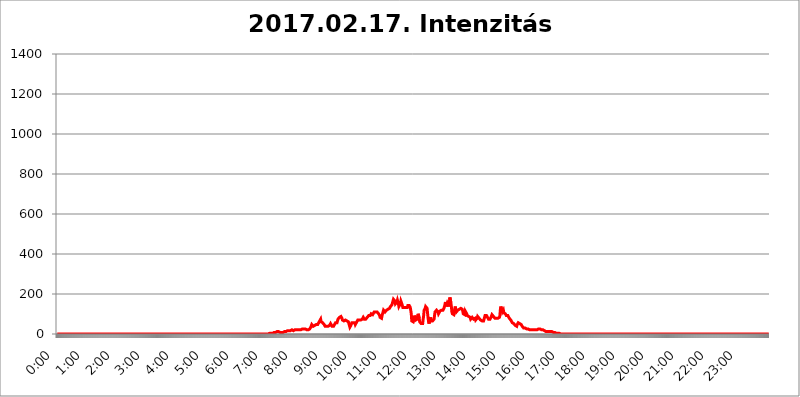
| Category | 2017.02.17. Intenzitás [W/m^2] |
|---|---|
| 0.0 | 0 |
| 0.0006944444444444445 | 0 |
| 0.001388888888888889 | 0 |
| 0.0020833333333333333 | 0 |
| 0.002777777777777778 | 0 |
| 0.003472222222222222 | 0 |
| 0.004166666666666667 | 0 |
| 0.004861111111111111 | 0 |
| 0.005555555555555556 | 0 |
| 0.0062499999999999995 | 0 |
| 0.006944444444444444 | 0 |
| 0.007638888888888889 | 0 |
| 0.008333333333333333 | 0 |
| 0.009027777777777779 | 0 |
| 0.009722222222222222 | 0 |
| 0.010416666666666666 | 0 |
| 0.011111111111111112 | 0 |
| 0.011805555555555555 | 0 |
| 0.012499999999999999 | 0 |
| 0.013194444444444444 | 0 |
| 0.013888888888888888 | 0 |
| 0.014583333333333332 | 0 |
| 0.015277777777777777 | 0 |
| 0.015972222222222224 | 0 |
| 0.016666666666666666 | 0 |
| 0.017361111111111112 | 0 |
| 0.018055555555555557 | 0 |
| 0.01875 | 0 |
| 0.019444444444444445 | 0 |
| 0.02013888888888889 | 0 |
| 0.020833333333333332 | 0 |
| 0.02152777777777778 | 0 |
| 0.022222222222222223 | 0 |
| 0.02291666666666667 | 0 |
| 0.02361111111111111 | 0 |
| 0.024305555555555556 | 0 |
| 0.024999999999999998 | 0 |
| 0.025694444444444447 | 0 |
| 0.02638888888888889 | 0 |
| 0.027083333333333334 | 0 |
| 0.027777777777777776 | 0 |
| 0.02847222222222222 | 0 |
| 0.029166666666666664 | 0 |
| 0.029861111111111113 | 0 |
| 0.030555555555555555 | 0 |
| 0.03125 | 0 |
| 0.03194444444444445 | 0 |
| 0.03263888888888889 | 0 |
| 0.03333333333333333 | 0 |
| 0.034027777777777775 | 0 |
| 0.034722222222222224 | 0 |
| 0.035416666666666666 | 0 |
| 0.036111111111111115 | 0 |
| 0.03680555555555556 | 0 |
| 0.0375 | 0 |
| 0.03819444444444444 | 0 |
| 0.03888888888888889 | 0 |
| 0.03958333333333333 | 0 |
| 0.04027777777777778 | 0 |
| 0.04097222222222222 | 0 |
| 0.041666666666666664 | 0 |
| 0.042361111111111106 | 0 |
| 0.04305555555555556 | 0 |
| 0.043750000000000004 | 0 |
| 0.044444444444444446 | 0 |
| 0.04513888888888889 | 0 |
| 0.04583333333333334 | 0 |
| 0.04652777777777778 | 0 |
| 0.04722222222222222 | 0 |
| 0.04791666666666666 | 0 |
| 0.04861111111111111 | 0 |
| 0.049305555555555554 | 0 |
| 0.049999999999999996 | 0 |
| 0.05069444444444445 | 0 |
| 0.051388888888888894 | 0 |
| 0.052083333333333336 | 0 |
| 0.05277777777777778 | 0 |
| 0.05347222222222222 | 0 |
| 0.05416666666666667 | 0 |
| 0.05486111111111111 | 0 |
| 0.05555555555555555 | 0 |
| 0.05625 | 0 |
| 0.05694444444444444 | 0 |
| 0.057638888888888885 | 0 |
| 0.05833333333333333 | 0 |
| 0.05902777777777778 | 0 |
| 0.059722222222222225 | 0 |
| 0.06041666666666667 | 0 |
| 0.061111111111111116 | 0 |
| 0.06180555555555556 | 0 |
| 0.0625 | 0 |
| 0.06319444444444444 | 0 |
| 0.06388888888888888 | 0 |
| 0.06458333333333334 | 0 |
| 0.06527777777777778 | 0 |
| 0.06597222222222222 | 0 |
| 0.06666666666666667 | 0 |
| 0.06736111111111111 | 0 |
| 0.06805555555555555 | 0 |
| 0.06874999999999999 | 0 |
| 0.06944444444444443 | 0 |
| 0.07013888888888889 | 0 |
| 0.07083333333333333 | 0 |
| 0.07152777777777779 | 0 |
| 0.07222222222222223 | 0 |
| 0.07291666666666667 | 0 |
| 0.07361111111111111 | 0 |
| 0.07430555555555556 | 0 |
| 0.075 | 0 |
| 0.07569444444444444 | 0 |
| 0.0763888888888889 | 0 |
| 0.07708333333333334 | 0 |
| 0.07777777777777778 | 0 |
| 0.07847222222222222 | 0 |
| 0.07916666666666666 | 0 |
| 0.0798611111111111 | 0 |
| 0.08055555555555556 | 0 |
| 0.08125 | 0 |
| 0.08194444444444444 | 0 |
| 0.08263888888888889 | 0 |
| 0.08333333333333333 | 0 |
| 0.08402777777777777 | 0 |
| 0.08472222222222221 | 0 |
| 0.08541666666666665 | 0 |
| 0.08611111111111112 | 0 |
| 0.08680555555555557 | 0 |
| 0.08750000000000001 | 0 |
| 0.08819444444444445 | 0 |
| 0.08888888888888889 | 0 |
| 0.08958333333333333 | 0 |
| 0.09027777777777778 | 0 |
| 0.09097222222222222 | 0 |
| 0.09166666666666667 | 0 |
| 0.09236111111111112 | 0 |
| 0.09305555555555556 | 0 |
| 0.09375 | 0 |
| 0.09444444444444444 | 0 |
| 0.09513888888888888 | 0 |
| 0.09583333333333333 | 0 |
| 0.09652777777777777 | 0 |
| 0.09722222222222222 | 0 |
| 0.09791666666666667 | 0 |
| 0.09861111111111111 | 0 |
| 0.09930555555555555 | 0 |
| 0.09999999999999999 | 0 |
| 0.10069444444444443 | 0 |
| 0.1013888888888889 | 0 |
| 0.10208333333333335 | 0 |
| 0.10277777777777779 | 0 |
| 0.10347222222222223 | 0 |
| 0.10416666666666667 | 0 |
| 0.10486111111111111 | 0 |
| 0.10555555555555556 | 0 |
| 0.10625 | 0 |
| 0.10694444444444444 | 0 |
| 0.1076388888888889 | 0 |
| 0.10833333333333334 | 0 |
| 0.10902777777777778 | 0 |
| 0.10972222222222222 | 0 |
| 0.1111111111111111 | 0 |
| 0.11180555555555556 | 0 |
| 0.11180555555555556 | 0 |
| 0.1125 | 0 |
| 0.11319444444444444 | 0 |
| 0.11388888888888889 | 0 |
| 0.11458333333333333 | 0 |
| 0.11527777777777777 | 0 |
| 0.11597222222222221 | 0 |
| 0.11666666666666665 | 0 |
| 0.1173611111111111 | 0 |
| 0.11805555555555557 | 0 |
| 0.11944444444444445 | 0 |
| 0.12013888888888889 | 0 |
| 0.12083333333333333 | 0 |
| 0.12152777777777778 | 0 |
| 0.12222222222222223 | 0 |
| 0.12291666666666667 | 0 |
| 0.12291666666666667 | 0 |
| 0.12361111111111112 | 0 |
| 0.12430555555555556 | 0 |
| 0.125 | 0 |
| 0.12569444444444444 | 0 |
| 0.12638888888888888 | 0 |
| 0.12708333333333333 | 0 |
| 0.16875 | 0 |
| 0.12847222222222224 | 0 |
| 0.12916666666666668 | 0 |
| 0.12986111111111112 | 0 |
| 0.13055555555555556 | 0 |
| 0.13125 | 0 |
| 0.13194444444444445 | 0 |
| 0.1326388888888889 | 0 |
| 0.13333333333333333 | 0 |
| 0.13402777777777777 | 0 |
| 0.13402777777777777 | 0 |
| 0.13472222222222222 | 0 |
| 0.13541666666666666 | 0 |
| 0.1361111111111111 | 0 |
| 0.13749999999999998 | 0 |
| 0.13819444444444443 | 0 |
| 0.1388888888888889 | 0 |
| 0.13958333333333334 | 0 |
| 0.14027777777777778 | 0 |
| 0.14097222222222222 | 0 |
| 0.14166666666666666 | 0 |
| 0.1423611111111111 | 0 |
| 0.14305555555555557 | 0 |
| 0.14375000000000002 | 0 |
| 0.14444444444444446 | 0 |
| 0.1451388888888889 | 0 |
| 0.1451388888888889 | 0 |
| 0.14652777777777778 | 0 |
| 0.14722222222222223 | 0 |
| 0.14791666666666667 | 0 |
| 0.1486111111111111 | 0 |
| 0.14930555555555555 | 0 |
| 0.15 | 0 |
| 0.15069444444444444 | 0 |
| 0.15138888888888888 | 0 |
| 0.15208333333333332 | 0 |
| 0.15277777777777776 | 0 |
| 0.15347222222222223 | 0 |
| 0.15416666666666667 | 0 |
| 0.15486111111111112 | 0 |
| 0.15555555555555556 | 0 |
| 0.15625 | 0 |
| 0.15694444444444444 | 0 |
| 0.15763888888888888 | 0 |
| 0.15833333333333333 | 0 |
| 0.15902777777777777 | 0 |
| 0.15972222222222224 | 0 |
| 0.16041666666666668 | 0 |
| 0.16111111111111112 | 0 |
| 0.16180555555555556 | 0 |
| 0.1625 | 0 |
| 0.16319444444444445 | 0 |
| 0.1638888888888889 | 0 |
| 0.16458333333333333 | 0 |
| 0.16527777777777777 | 0 |
| 0.16597222222222222 | 0 |
| 0.16666666666666666 | 0 |
| 0.1673611111111111 | 0 |
| 0.16805555555555554 | 0 |
| 0.16874999999999998 | 0 |
| 0.16944444444444443 | 0 |
| 0.17013888888888887 | 0 |
| 0.1708333333333333 | 0 |
| 0.17152777777777775 | 0 |
| 0.17222222222222225 | 0 |
| 0.1729166666666667 | 0 |
| 0.17361111111111113 | 0 |
| 0.17430555555555557 | 0 |
| 0.17500000000000002 | 0 |
| 0.17569444444444446 | 0 |
| 0.1763888888888889 | 0 |
| 0.17708333333333334 | 0 |
| 0.17777777777777778 | 0 |
| 0.17847222222222223 | 0 |
| 0.17916666666666667 | 0 |
| 0.1798611111111111 | 0 |
| 0.18055555555555555 | 0 |
| 0.18125 | 0 |
| 0.18194444444444444 | 0 |
| 0.1826388888888889 | 0 |
| 0.18333333333333335 | 0 |
| 0.1840277777777778 | 0 |
| 0.18472222222222223 | 0 |
| 0.18541666666666667 | 0 |
| 0.18611111111111112 | 0 |
| 0.18680555555555556 | 0 |
| 0.1875 | 0 |
| 0.18819444444444444 | 0 |
| 0.18888888888888888 | 0 |
| 0.18958333333333333 | 0 |
| 0.19027777777777777 | 0 |
| 0.1909722222222222 | 0 |
| 0.19166666666666665 | 0 |
| 0.19236111111111112 | 0 |
| 0.19305555555555554 | 0 |
| 0.19375 | 0 |
| 0.19444444444444445 | 0 |
| 0.1951388888888889 | 0 |
| 0.19583333333333333 | 0 |
| 0.19652777777777777 | 0 |
| 0.19722222222222222 | 0 |
| 0.19791666666666666 | 0 |
| 0.1986111111111111 | 0 |
| 0.19930555555555554 | 0 |
| 0.19999999999999998 | 0 |
| 0.20069444444444443 | 0 |
| 0.20138888888888887 | 0 |
| 0.2020833333333333 | 0 |
| 0.2027777777777778 | 0 |
| 0.2034722222222222 | 0 |
| 0.2041666666666667 | 0 |
| 0.20486111111111113 | 0 |
| 0.20555555555555557 | 0 |
| 0.20625000000000002 | 0 |
| 0.20694444444444446 | 0 |
| 0.2076388888888889 | 0 |
| 0.20833333333333334 | 0 |
| 0.20902777777777778 | 0 |
| 0.20972222222222223 | 0 |
| 0.21041666666666667 | 0 |
| 0.2111111111111111 | 0 |
| 0.21180555555555555 | 0 |
| 0.2125 | 0 |
| 0.21319444444444444 | 0 |
| 0.2138888888888889 | 0 |
| 0.21458333333333335 | 0 |
| 0.2152777777777778 | 0 |
| 0.21597222222222223 | 0 |
| 0.21666666666666667 | 0 |
| 0.21736111111111112 | 0 |
| 0.21805555555555556 | 0 |
| 0.21875 | 0 |
| 0.21944444444444444 | 0 |
| 0.22013888888888888 | 0 |
| 0.22083333333333333 | 0 |
| 0.22152777777777777 | 0 |
| 0.2222222222222222 | 0 |
| 0.22291666666666665 | 0 |
| 0.2236111111111111 | 0 |
| 0.22430555555555556 | 0 |
| 0.225 | 0 |
| 0.22569444444444445 | 0 |
| 0.2263888888888889 | 0 |
| 0.22708333333333333 | 0 |
| 0.22777777777777777 | 0 |
| 0.22847222222222222 | 0 |
| 0.22916666666666666 | 0 |
| 0.2298611111111111 | 0 |
| 0.23055555555555554 | 0 |
| 0.23124999999999998 | 0 |
| 0.23194444444444443 | 0 |
| 0.23263888888888887 | 0 |
| 0.2333333333333333 | 0 |
| 0.2340277777777778 | 0 |
| 0.2347222222222222 | 0 |
| 0.2354166666666667 | 0 |
| 0.23611111111111113 | 0 |
| 0.23680555555555557 | 0 |
| 0.23750000000000002 | 0 |
| 0.23819444444444446 | 0 |
| 0.2388888888888889 | 0 |
| 0.23958333333333334 | 0 |
| 0.24027777777777778 | 0 |
| 0.24097222222222223 | 0 |
| 0.24166666666666667 | 0 |
| 0.2423611111111111 | 0 |
| 0.24305555555555555 | 0 |
| 0.24375 | 0 |
| 0.24444444444444446 | 0 |
| 0.24513888888888888 | 0 |
| 0.24583333333333335 | 0 |
| 0.2465277777777778 | 0 |
| 0.24722222222222223 | 0 |
| 0.24791666666666667 | 0 |
| 0.24861111111111112 | 0 |
| 0.24930555555555556 | 0 |
| 0.25 | 0 |
| 0.25069444444444444 | 0 |
| 0.2513888888888889 | 0 |
| 0.2520833333333333 | 0 |
| 0.25277777777777777 | 0 |
| 0.2534722222222222 | 0 |
| 0.25416666666666665 | 0 |
| 0.2548611111111111 | 0 |
| 0.2555555555555556 | 0 |
| 0.25625000000000003 | 0 |
| 0.2569444444444445 | 0 |
| 0.2576388888888889 | 0 |
| 0.25833333333333336 | 0 |
| 0.2590277777777778 | 0 |
| 0.25972222222222224 | 0 |
| 0.2604166666666667 | 0 |
| 0.2611111111111111 | 0 |
| 0.26180555555555557 | 0 |
| 0.2625 | 0 |
| 0.26319444444444445 | 0 |
| 0.2638888888888889 | 0 |
| 0.26458333333333334 | 0 |
| 0.2652777777777778 | 0 |
| 0.2659722222222222 | 0 |
| 0.26666666666666666 | 0 |
| 0.2673611111111111 | 0 |
| 0.26805555555555555 | 0 |
| 0.26875 | 0 |
| 0.26944444444444443 | 0 |
| 0.2701388888888889 | 0 |
| 0.2708333333333333 | 0 |
| 0.27152777777777776 | 0 |
| 0.2722222222222222 | 0 |
| 0.27291666666666664 | 0 |
| 0.2736111111111111 | 0 |
| 0.2743055555555555 | 0 |
| 0.27499999999999997 | 0 |
| 0.27569444444444446 | 0 |
| 0.27638888888888885 | 0 |
| 0.27708333333333335 | 0 |
| 0.2777777777777778 | 0 |
| 0.27847222222222223 | 0 |
| 0.2791666666666667 | 0 |
| 0.2798611111111111 | 0 |
| 0.28055555555555556 | 0 |
| 0.28125 | 0 |
| 0.28194444444444444 | 0 |
| 0.2826388888888889 | 0 |
| 0.2833333333333333 | 0 |
| 0.28402777777777777 | 0 |
| 0.2847222222222222 | 0 |
| 0.28541666666666665 | 0 |
| 0.28611111111111115 | 0 |
| 0.28680555555555554 | 0 |
| 0.28750000000000003 | 0 |
| 0.2881944444444445 | 0 |
| 0.2888888888888889 | 0 |
| 0.28958333333333336 | 0 |
| 0.2902777777777778 | 0 |
| 0.29097222222222224 | 0 |
| 0.2916666666666667 | 0 |
| 0.2923611111111111 | 0 |
| 0.29305555555555557 | 0 |
| 0.29375 | 0 |
| 0.29444444444444445 | 0 |
| 0.2951388888888889 | 0 |
| 0.29583333333333334 | 0 |
| 0.2965277777777778 | 3.525 |
| 0.2972222222222222 | 3.525 |
| 0.29791666666666666 | 3.525 |
| 0.2986111111111111 | 3.525 |
| 0.29930555555555555 | 3.525 |
| 0.3 | 3.525 |
| 0.30069444444444443 | 3.525 |
| 0.3013888888888889 | 3.525 |
| 0.3020833333333333 | 3.525 |
| 0.30277777777777776 | 3.525 |
| 0.3034722222222222 | 7.887 |
| 0.30416666666666664 | 7.887 |
| 0.3048611111111111 | 7.887 |
| 0.3055555555555555 | 7.887 |
| 0.30624999999999997 | 7.887 |
| 0.3069444444444444 | 7.887 |
| 0.3076388888888889 | 7.887 |
| 0.30833333333333335 | 12.257 |
| 0.3090277777777778 | 12.257 |
| 0.30972222222222223 | 12.257 |
| 0.3104166666666667 | 12.257 |
| 0.3111111111111111 | 7.887 |
| 0.31180555555555556 | 7.887 |
| 0.3125 | 7.887 |
| 0.31319444444444444 | 7.887 |
| 0.3138888888888889 | 7.887 |
| 0.3145833333333333 | 7.887 |
| 0.31527777777777777 | 7.887 |
| 0.3159722222222222 | 7.887 |
| 0.31666666666666665 | 7.887 |
| 0.31736111111111115 | 7.887 |
| 0.31805555555555554 | 7.887 |
| 0.31875000000000003 | 12.257 |
| 0.3194444444444445 | 12.257 |
| 0.3201388888888889 | 12.257 |
| 0.32083333333333336 | 12.257 |
| 0.3215277777777778 | 12.257 |
| 0.32222222222222224 | 12.257 |
| 0.3229166666666667 | 16.636 |
| 0.3236111111111111 | 16.636 |
| 0.32430555555555557 | 16.636 |
| 0.325 | 16.636 |
| 0.32569444444444445 | 16.636 |
| 0.3263888888888889 | 16.636 |
| 0.32708333333333334 | 16.636 |
| 0.3277777777777778 | 21.024 |
| 0.3284722222222222 | 21.024 |
| 0.32916666666666666 | 21.024 |
| 0.3298611111111111 | 21.024 |
| 0.33055555555555555 | 21.024 |
| 0.33125 | 16.636 |
| 0.33194444444444443 | 21.024 |
| 0.3326388888888889 | 21.024 |
| 0.3333333333333333 | 21.024 |
| 0.3340277777777778 | 21.024 |
| 0.3347222222222222 | 21.024 |
| 0.3354166666666667 | 21.024 |
| 0.3361111111111111 | 21.024 |
| 0.3368055555555556 | 21.024 |
| 0.33749999999999997 | 21.024 |
| 0.33819444444444446 | 21.024 |
| 0.33888888888888885 | 21.024 |
| 0.33958333333333335 | 21.024 |
| 0.34027777777777773 | 21.024 |
| 0.34097222222222223 | 21.024 |
| 0.3416666666666666 | 21.024 |
| 0.3423611111111111 | 21.024 |
| 0.3430555555555555 | 21.024 |
| 0.34375 | 25.419 |
| 0.3444444444444445 | 25.419 |
| 0.3451388888888889 | 25.419 |
| 0.3458333333333334 | 25.419 |
| 0.34652777777777777 | 25.419 |
| 0.34722222222222227 | 25.419 |
| 0.34791666666666665 | 25.419 |
| 0.34861111111111115 | 25.419 |
| 0.34930555555555554 | 25.419 |
| 0.35000000000000003 | 21.024 |
| 0.3506944444444444 | 25.419 |
| 0.3513888888888889 | 21.024 |
| 0.3520833333333333 | 21.024 |
| 0.3527777777777778 | 21.024 |
| 0.3534722222222222 | 25.419 |
| 0.3541666666666667 | 25.419 |
| 0.3548611111111111 | 29.823 |
| 0.35555555555555557 | 34.234 |
| 0.35625 | 38.653 |
| 0.35694444444444445 | 47.511 |
| 0.3576388888888889 | 43.079 |
| 0.35833333333333334 | 43.079 |
| 0.3590277777777778 | 38.653 |
| 0.3597222222222222 | 38.653 |
| 0.36041666666666666 | 38.653 |
| 0.3611111111111111 | 43.079 |
| 0.36180555555555555 | 43.079 |
| 0.3625 | 47.511 |
| 0.36319444444444443 | 47.511 |
| 0.3638888888888889 | 47.511 |
| 0.3645833333333333 | 47.511 |
| 0.3652777777777778 | 47.511 |
| 0.3659722222222222 | 47.511 |
| 0.3666666666666667 | 51.951 |
| 0.3673611111111111 | 60.85 |
| 0.3680555555555556 | 56.398 |
| 0.36874999999999997 | 65.31 |
| 0.36944444444444446 | 74.246 |
| 0.37013888888888885 | 60.85 |
| 0.37083333333333335 | 60.85 |
| 0.37152777777777773 | 56.398 |
| 0.37222222222222223 | 56.398 |
| 0.3729166666666666 | 56.398 |
| 0.3736111111111111 | 51.951 |
| 0.3743055555555555 | 47.511 |
| 0.375 | 43.079 |
| 0.3756944444444445 | 38.653 |
| 0.3763888888888889 | 38.653 |
| 0.3770833333333334 | 38.653 |
| 0.37777777777777777 | 38.653 |
| 0.37847222222222227 | 38.653 |
| 0.37916666666666665 | 38.653 |
| 0.37986111111111115 | 38.653 |
| 0.38055555555555554 | 43.079 |
| 0.38125000000000003 | 38.653 |
| 0.3819444444444444 | 43.079 |
| 0.3826388888888889 | 47.511 |
| 0.3833333333333333 | 51.951 |
| 0.3840277777777778 | 51.951 |
| 0.3847222222222222 | 47.511 |
| 0.3854166666666667 | 38.653 |
| 0.3861111111111111 | 38.653 |
| 0.38680555555555557 | 38.653 |
| 0.3875 | 38.653 |
| 0.38819444444444445 | 43.079 |
| 0.3888888888888889 | 47.511 |
| 0.38958333333333334 | 51.951 |
| 0.3902777777777778 | 56.398 |
| 0.3909722222222222 | 51.951 |
| 0.39166666666666666 | 51.951 |
| 0.3923611111111111 | 56.398 |
| 0.39305555555555555 | 60.85 |
| 0.39375 | 74.246 |
| 0.39444444444444443 | 74.246 |
| 0.3951388888888889 | 78.722 |
| 0.3958333333333333 | 83.205 |
| 0.3965277777777778 | 83.205 |
| 0.3972222222222222 | 87.692 |
| 0.3979166666666667 | 87.692 |
| 0.3986111111111111 | 83.205 |
| 0.3993055555555556 | 78.722 |
| 0.39999999999999997 | 69.775 |
| 0.40069444444444446 | 69.775 |
| 0.40138888888888885 | 65.31 |
| 0.40208333333333335 | 65.31 |
| 0.40277777777777773 | 65.31 |
| 0.40347222222222223 | 69.775 |
| 0.4041666666666666 | 69.775 |
| 0.4048611111111111 | 65.31 |
| 0.4055555555555555 | 65.31 |
| 0.40625 | 65.31 |
| 0.4069444444444445 | 60.85 |
| 0.4076388888888889 | 65.31 |
| 0.4083333333333334 | 60.85 |
| 0.40902777777777777 | 51.951 |
| 0.40972222222222227 | 43.079 |
| 0.41041666666666665 | 34.234 |
| 0.41111111111111115 | 38.653 |
| 0.41180555555555554 | 43.079 |
| 0.41250000000000003 | 47.511 |
| 0.4131944444444444 | 56.398 |
| 0.4138888888888889 | 56.398 |
| 0.4145833333333333 | 51.951 |
| 0.4152777777777778 | 56.398 |
| 0.4159722222222222 | 56.398 |
| 0.4166666666666667 | 56.398 |
| 0.4173611111111111 | 56.398 |
| 0.41805555555555557 | 47.511 |
| 0.41875 | 47.511 |
| 0.41944444444444445 | 47.511 |
| 0.4201388888888889 | 60.85 |
| 0.42083333333333334 | 65.31 |
| 0.4215277777777778 | 69.775 |
| 0.4222222222222222 | 69.775 |
| 0.42291666666666666 | 69.775 |
| 0.4236111111111111 | 69.775 |
| 0.42430555555555555 | 69.775 |
| 0.425 | 69.775 |
| 0.42569444444444443 | 69.775 |
| 0.4263888888888889 | 74.246 |
| 0.4270833333333333 | 74.246 |
| 0.4277777777777778 | 74.246 |
| 0.4284722222222222 | 78.722 |
| 0.4291666666666667 | 83.205 |
| 0.4298611111111111 | 78.722 |
| 0.4305555555555556 | 74.246 |
| 0.43124999999999997 | 74.246 |
| 0.43194444444444446 | 74.246 |
| 0.43263888888888885 | 74.246 |
| 0.43333333333333335 | 74.246 |
| 0.43402777777777773 | 78.722 |
| 0.43472222222222223 | 83.205 |
| 0.4354166666666666 | 83.205 |
| 0.4361111111111111 | 87.692 |
| 0.4368055555555555 | 92.184 |
| 0.4375 | 87.692 |
| 0.4381944444444445 | 92.184 |
| 0.4388888888888889 | 92.184 |
| 0.4395833333333334 | 96.682 |
| 0.44027777777777777 | 101.184 |
| 0.44097222222222227 | 101.184 |
| 0.44166666666666665 | 101.184 |
| 0.44236111111111115 | 96.682 |
| 0.44305555555555554 | 96.682 |
| 0.44375000000000003 | 96.682 |
| 0.4444444444444444 | 110.201 |
| 0.4451388888888889 | 114.716 |
| 0.4458333333333333 | 114.716 |
| 0.4465277777777778 | 110.201 |
| 0.4472222222222222 | 105.69 |
| 0.4479166666666667 | 105.69 |
| 0.4486111111111111 | 110.201 |
| 0.44930555555555557 | 105.69 |
| 0.45 | 105.69 |
| 0.45069444444444445 | 101.184 |
| 0.4513888888888889 | 96.682 |
| 0.45208333333333334 | 92.184 |
| 0.4527777777777778 | 83.205 |
| 0.4534722222222222 | 83.205 |
| 0.45416666666666666 | 78.722 |
| 0.4548611111111111 | 78.722 |
| 0.45555555555555555 | 92.184 |
| 0.45625 | 96.682 |
| 0.45694444444444443 | 110.201 |
| 0.4576388888888889 | 119.235 |
| 0.4583333333333333 | 119.235 |
| 0.4590277777777778 | 114.716 |
| 0.4597222222222222 | 110.201 |
| 0.4604166666666667 | 105.69 |
| 0.4611111111111111 | 110.201 |
| 0.4618055555555556 | 119.235 |
| 0.46249999999999997 | 123.758 |
| 0.46319444444444446 | 123.758 |
| 0.46388888888888885 | 123.758 |
| 0.46458333333333335 | 123.758 |
| 0.46527777777777773 | 123.758 |
| 0.46597222222222223 | 128.284 |
| 0.4666666666666666 | 132.814 |
| 0.4673611111111111 | 137.347 |
| 0.4680555555555555 | 137.347 |
| 0.46875 | 137.347 |
| 0.4694444444444445 | 146.423 |
| 0.4701388888888889 | 155.509 |
| 0.4708333333333334 | 164.605 |
| 0.47152777777777777 | 173.709 |
| 0.47222222222222227 | 178.264 |
| 0.47291666666666665 | 169.156 |
| 0.47361111111111115 | 164.605 |
| 0.47430555555555554 | 150.964 |
| 0.47500000000000003 | 146.423 |
| 0.4756944444444444 | 146.423 |
| 0.4763888888888889 | 160.056 |
| 0.4770833333333333 | 169.156 |
| 0.4777777777777778 | 164.605 |
| 0.4784722222222222 | 150.964 |
| 0.4791666666666667 | 137.347 |
| 0.4798611111111111 | 137.347 |
| 0.48055555555555557 | 141.884 |
| 0.48125 | 150.964 |
| 0.48194444444444445 | 164.605 |
| 0.4826388888888889 | 160.056 |
| 0.48333333333333334 | 150.964 |
| 0.4840277777777778 | 141.884 |
| 0.4847222222222222 | 132.814 |
| 0.48541666666666666 | 128.284 |
| 0.4861111111111111 | 128.284 |
| 0.48680555555555555 | 132.814 |
| 0.4875 | 132.814 |
| 0.48819444444444443 | 132.814 |
| 0.4888888888888889 | 132.814 |
| 0.4895833333333333 | 132.814 |
| 0.4902777777777778 | 132.814 |
| 0.4909722222222222 | 132.814 |
| 0.4916666666666667 | 141.884 |
| 0.4923611111111111 | 146.423 |
| 0.4930555555555556 | 146.423 |
| 0.49374999999999997 | 141.884 |
| 0.49444444444444446 | 137.347 |
| 0.49513888888888885 | 132.814 |
| 0.49583333333333335 | 132.814 |
| 0.49652777777777773 | 101.184 |
| 0.49722222222222223 | 65.31 |
| 0.4979166666666666 | 60.85 |
| 0.4986111111111111 | 65.31 |
| 0.4993055555555555 | 60.85 |
| 0.5 | 65.31 |
| 0.5006944444444444 | 78.722 |
| 0.5013888888888889 | 92.184 |
| 0.5020833333333333 | 83.205 |
| 0.5027777777777778 | 69.775 |
| 0.5034722222222222 | 65.31 |
| 0.5041666666666667 | 69.775 |
| 0.5048611111111111 | 74.246 |
| 0.5055555555555555 | 78.722 |
| 0.50625 | 101.184 |
| 0.5069444444444444 | 101.184 |
| 0.5076388888888889 | 78.722 |
| 0.5083333333333333 | 60.85 |
| 0.5090277777777777 | 56.398 |
| 0.5097222222222222 | 56.398 |
| 0.5104166666666666 | 51.951 |
| 0.5111111111111112 | 47.511 |
| 0.5118055555555555 | 47.511 |
| 0.5125000000000001 | 51.951 |
| 0.5131944444444444 | 74.246 |
| 0.513888888888889 | 92.184 |
| 0.5145833333333333 | 119.235 |
| 0.5152777777777778 | 123.758 |
| 0.5159722222222222 | 128.284 |
| 0.5166666666666667 | 137.347 |
| 0.517361111111111 | 137.347 |
| 0.5180555555555556 | 132.814 |
| 0.5187499999999999 | 128.284 |
| 0.5194444444444445 | 101.184 |
| 0.5201388888888888 | 78.722 |
| 0.5208333333333334 | 60.85 |
| 0.5215277777777778 | 51.951 |
| 0.5222222222222223 | 69.775 |
| 0.5229166666666667 | 74.246 |
| 0.5236111111111111 | 83.205 |
| 0.5243055555555556 | 65.31 |
| 0.525 | 69.775 |
| 0.5256944444444445 | 69.775 |
| 0.5263888888888889 | 65.31 |
| 0.5270833333333333 | 65.31 |
| 0.5277777777777778 | 69.775 |
| 0.5284722222222222 | 74.246 |
| 0.5291666666666667 | 92.184 |
| 0.5298611111111111 | 110.201 |
| 0.5305555555555556 | 105.69 |
| 0.53125 | 114.716 |
| 0.5319444444444444 | 119.235 |
| 0.5326388888888889 | 119.235 |
| 0.5333333333333333 | 114.716 |
| 0.5340277777777778 | 110.201 |
| 0.5347222222222222 | 101.184 |
| 0.5354166666666667 | 101.184 |
| 0.5361111111111111 | 105.69 |
| 0.5368055555555555 | 114.716 |
| 0.5375 | 119.235 |
| 0.5381944444444444 | 119.235 |
| 0.5388888888888889 | 119.235 |
| 0.5395833333333333 | 119.235 |
| 0.5402777777777777 | 119.235 |
| 0.5409722222222222 | 119.235 |
| 0.5416666666666666 | 119.235 |
| 0.5423611111111112 | 128.284 |
| 0.5430555555555555 | 132.814 |
| 0.5437500000000001 | 146.423 |
| 0.5444444444444444 | 160.056 |
| 0.545138888888889 | 150.964 |
| 0.5458333333333333 | 137.347 |
| 0.5465277777777778 | 137.347 |
| 0.5472222222222222 | 155.509 |
| 0.5479166666666667 | 155.509 |
| 0.548611111111111 | 146.423 |
| 0.5493055555555556 | 137.347 |
| 0.5499999999999999 | 160.056 |
| 0.5506944444444445 | 182.82 |
| 0.5513888888888888 | 182.82 |
| 0.5520833333333334 | 155.509 |
| 0.5527777777777778 | 137.347 |
| 0.5534722222222223 | 110.201 |
| 0.5541666666666667 | 101.184 |
| 0.5548611111111111 | 101.184 |
| 0.5555555555555556 | 96.682 |
| 0.55625 | 96.682 |
| 0.5569444444444445 | 101.184 |
| 0.5576388888888889 | 128.284 |
| 0.5583333333333333 | 137.347 |
| 0.5590277777777778 | 119.235 |
| 0.5597222222222222 | 110.201 |
| 0.5604166666666667 | 105.69 |
| 0.5611111111111111 | 114.716 |
| 0.5618055555555556 | 119.235 |
| 0.5625 | 119.235 |
| 0.5631944444444444 | 119.235 |
| 0.5638888888888889 | 123.758 |
| 0.5645833333333333 | 119.235 |
| 0.5652777777777778 | 123.758 |
| 0.5659722222222222 | 128.284 |
| 0.5666666666666667 | 132.814 |
| 0.5673611111111111 | 132.814 |
| 0.5680555555555555 | 123.758 |
| 0.56875 | 114.716 |
| 0.5694444444444444 | 101.184 |
| 0.5701388888888889 | 105.69 |
| 0.5708333333333333 | 101.184 |
| 0.5715277777777777 | 96.682 |
| 0.5722222222222222 | 114.716 |
| 0.5729166666666666 | 119.235 |
| 0.5736111111111112 | 110.201 |
| 0.5743055555555555 | 101.184 |
| 0.5750000000000001 | 92.184 |
| 0.5756944444444444 | 87.692 |
| 0.576388888888889 | 87.692 |
| 0.5770833333333333 | 87.692 |
| 0.5777777777777778 | 87.692 |
| 0.5784722222222222 | 87.692 |
| 0.5791666666666667 | 83.205 |
| 0.579861111111111 | 74.246 |
| 0.5805555555555556 | 74.246 |
| 0.5812499999999999 | 78.722 |
| 0.5819444444444445 | 83.205 |
| 0.5826388888888888 | 83.205 |
| 0.5833333333333334 | 78.722 |
| 0.5840277777777778 | 74.246 |
| 0.5847222222222223 | 74.246 |
| 0.5854166666666667 | 74.246 |
| 0.5861111111111111 | 78.722 |
| 0.5868055555555556 | 69.775 |
| 0.5875 | 65.31 |
| 0.5881944444444445 | 65.31 |
| 0.5888888888888889 | 78.722 |
| 0.5895833333333333 | 87.692 |
| 0.5902777777777778 | 92.184 |
| 0.5909722222222222 | 83.205 |
| 0.5916666666666667 | 78.722 |
| 0.5923611111111111 | 78.722 |
| 0.5930555555555556 | 74.246 |
| 0.59375 | 69.775 |
| 0.5944444444444444 | 74.246 |
| 0.5951388888888889 | 69.775 |
| 0.5958333333333333 | 65.31 |
| 0.5965277777777778 | 65.31 |
| 0.5972222222222222 | 60.85 |
| 0.5979166666666667 | 65.31 |
| 0.5986111111111111 | 74.246 |
| 0.5993055555555555 | 83.205 |
| 0.6 | 92.184 |
| 0.6006944444444444 | 96.682 |
| 0.6013888888888889 | 96.682 |
| 0.6020833333333333 | 92.184 |
| 0.6027777777777777 | 92.184 |
| 0.6034722222222222 | 83.205 |
| 0.6041666666666666 | 78.722 |
| 0.6048611111111112 | 74.246 |
| 0.6055555555555555 | 69.775 |
| 0.6062500000000001 | 69.775 |
| 0.6069444444444444 | 74.246 |
| 0.607638888888889 | 78.722 |
| 0.6083333333333333 | 83.205 |
| 0.6090277777777778 | 87.692 |
| 0.6097222222222222 | 96.682 |
| 0.6104166666666667 | 96.682 |
| 0.611111111111111 | 92.184 |
| 0.6118055555555556 | 87.692 |
| 0.6124999999999999 | 83.205 |
| 0.6131944444444445 | 83.205 |
| 0.6138888888888888 | 78.722 |
| 0.6145833333333334 | 74.246 |
| 0.6152777777777778 | 74.246 |
| 0.6159722222222223 | 78.722 |
| 0.6166666666666667 | 78.722 |
| 0.6173611111111111 | 78.722 |
| 0.6180555555555556 | 78.722 |
| 0.61875 | 78.722 |
| 0.6194444444444445 | 83.205 |
| 0.6201388888888889 | 83.205 |
| 0.6208333333333333 | 92.184 |
| 0.6215277777777778 | 123.758 |
| 0.6222222222222222 | 137.347 |
| 0.6229166666666667 | 137.347 |
| 0.6236111111111111 | 119.235 |
| 0.6243055555555556 | 110.201 |
| 0.625 | 114.716 |
| 0.6256944444444444 | 119.235 |
| 0.6263888888888889 | 105.69 |
| 0.6270833333333333 | 101.184 |
| 0.6277777777777778 | 105.69 |
| 0.6284722222222222 | 101.184 |
| 0.6291666666666667 | 96.682 |
| 0.6298611111111111 | 92.184 |
| 0.6305555555555555 | 87.692 |
| 0.63125 | 87.692 |
| 0.6319444444444444 | 92.184 |
| 0.6326388888888889 | 87.692 |
| 0.6333333333333333 | 87.692 |
| 0.6340277777777777 | 78.722 |
| 0.6347222222222222 | 83.205 |
| 0.6354166666666666 | 74.246 |
| 0.6361111111111112 | 69.775 |
| 0.6368055555555555 | 65.31 |
| 0.6375000000000001 | 65.31 |
| 0.6381944444444444 | 56.398 |
| 0.638888888888889 | 51.951 |
| 0.6395833333333333 | 51.951 |
| 0.6402777777777778 | 51.951 |
| 0.6409722222222222 | 51.951 |
| 0.6416666666666667 | 47.511 |
| 0.642361111111111 | 43.079 |
| 0.6430555555555556 | 43.079 |
| 0.6437499999999999 | 43.079 |
| 0.6444444444444445 | 38.653 |
| 0.6451388888888888 | 47.511 |
| 0.6458333333333334 | 51.951 |
| 0.6465277777777778 | 56.398 |
| 0.6472222222222223 | 56.398 |
| 0.6479166666666667 | 56.398 |
| 0.6486111111111111 | 51.951 |
| 0.6493055555555556 | 51.951 |
| 0.65 | 51.951 |
| 0.6506944444444445 | 47.511 |
| 0.6513888888888889 | 43.079 |
| 0.6520833333333333 | 38.653 |
| 0.6527777777777778 | 34.234 |
| 0.6534722222222222 | 34.234 |
| 0.6541666666666667 | 29.823 |
| 0.6548611111111111 | 34.234 |
| 0.6555555555555556 | 34.234 |
| 0.65625 | 29.823 |
| 0.6569444444444444 | 29.823 |
| 0.6576388888888889 | 29.823 |
| 0.6583333333333333 | 25.419 |
| 0.6590277777777778 | 21.024 |
| 0.6597222222222222 | 21.024 |
| 0.6604166666666667 | 25.419 |
| 0.6611111111111111 | 25.419 |
| 0.6618055555555555 | 21.024 |
| 0.6625 | 21.024 |
| 0.6631944444444444 | 16.636 |
| 0.6638888888888889 | 21.024 |
| 0.6645833333333333 | 21.024 |
| 0.6652777777777777 | 21.024 |
| 0.6659722222222222 | 21.024 |
| 0.6666666666666666 | 21.024 |
| 0.6673611111111111 | 21.024 |
| 0.6680555555555556 | 21.024 |
| 0.6687500000000001 | 21.024 |
| 0.6694444444444444 | 25.419 |
| 0.6701388888888888 | 25.419 |
| 0.6708333333333334 | 21.024 |
| 0.6715277777777778 | 21.024 |
| 0.6722222222222222 | 21.024 |
| 0.6729166666666666 | 21.024 |
| 0.6736111111111112 | 21.024 |
| 0.6743055555555556 | 21.024 |
| 0.6749999999999999 | 25.419 |
| 0.6756944444444444 | 29.823 |
| 0.6763888888888889 | 25.419 |
| 0.6770833333333334 | 25.419 |
| 0.6777777777777777 | 25.419 |
| 0.6784722222222223 | 21.024 |
| 0.6791666666666667 | 21.024 |
| 0.6798611111111111 | 21.024 |
| 0.6805555555555555 | 21.024 |
| 0.68125 | 21.024 |
| 0.6819444444444445 | 16.636 |
| 0.6826388888888889 | 16.636 |
| 0.6833333333333332 | 16.636 |
| 0.6840277777777778 | 16.636 |
| 0.6847222222222222 | 12.257 |
| 0.6854166666666667 | 12.257 |
| 0.686111111111111 | 12.257 |
| 0.6868055555555556 | 12.257 |
| 0.6875 | 12.257 |
| 0.6881944444444444 | 12.257 |
| 0.688888888888889 | 12.257 |
| 0.6895833333333333 | 12.257 |
| 0.6902777777777778 | 12.257 |
| 0.6909722222222222 | 12.257 |
| 0.6916666666666668 | 12.257 |
| 0.6923611111111111 | 12.257 |
| 0.6930555555555555 | 12.257 |
| 0.69375 | 12.257 |
| 0.6944444444444445 | 12.257 |
| 0.6951388888888889 | 12.257 |
| 0.6958333333333333 | 7.887 |
| 0.6965277777777777 | 12.257 |
| 0.6972222222222223 | 7.887 |
| 0.6979166666666666 | 7.887 |
| 0.6986111111111111 | 7.887 |
| 0.6993055555555556 | 7.887 |
| 0.7000000000000001 | 3.525 |
| 0.7006944444444444 | 3.525 |
| 0.7013888888888888 | 3.525 |
| 0.7020833333333334 | 3.525 |
| 0.7027777777777778 | 3.525 |
| 0.7034722222222222 | 3.525 |
| 0.7041666666666666 | 3.525 |
| 0.7048611111111112 | 0 |
| 0.7055555555555556 | 0 |
| 0.7062499999999999 | 0 |
| 0.7069444444444444 | 0 |
| 0.7076388888888889 | 0 |
| 0.7083333333333334 | 0 |
| 0.7090277777777777 | 0 |
| 0.7097222222222223 | 0 |
| 0.7104166666666667 | 0 |
| 0.7111111111111111 | 0 |
| 0.7118055555555555 | 0 |
| 0.7125 | 0 |
| 0.7131944444444445 | 0 |
| 0.7138888888888889 | 0 |
| 0.7145833333333332 | 0 |
| 0.7152777777777778 | 0 |
| 0.7159722222222222 | 0 |
| 0.7166666666666667 | 0 |
| 0.717361111111111 | 0 |
| 0.7180555555555556 | 0 |
| 0.71875 | 0 |
| 0.7194444444444444 | 0 |
| 0.720138888888889 | 0 |
| 0.7208333333333333 | 0 |
| 0.7215277777777778 | 0 |
| 0.7222222222222222 | 0 |
| 0.7229166666666668 | 0 |
| 0.7236111111111111 | 0 |
| 0.7243055555555555 | 0 |
| 0.725 | 0 |
| 0.7256944444444445 | 0 |
| 0.7263888888888889 | 0 |
| 0.7270833333333333 | 0 |
| 0.7277777777777777 | 0 |
| 0.7284722222222223 | 0 |
| 0.7291666666666666 | 0 |
| 0.7298611111111111 | 0 |
| 0.7305555555555556 | 0 |
| 0.7312500000000001 | 0 |
| 0.7319444444444444 | 0 |
| 0.7326388888888888 | 0 |
| 0.7333333333333334 | 0 |
| 0.7340277777777778 | 0 |
| 0.7347222222222222 | 0 |
| 0.7354166666666666 | 0 |
| 0.7361111111111112 | 0 |
| 0.7368055555555556 | 0 |
| 0.7374999999999999 | 0 |
| 0.7381944444444444 | 0 |
| 0.7388888888888889 | 0 |
| 0.7395833333333334 | 0 |
| 0.7402777777777777 | 0 |
| 0.7409722222222223 | 0 |
| 0.7416666666666667 | 0 |
| 0.7423611111111111 | 0 |
| 0.7430555555555555 | 0 |
| 0.74375 | 0 |
| 0.7444444444444445 | 0 |
| 0.7451388888888889 | 0 |
| 0.7458333333333332 | 0 |
| 0.7465277777777778 | 0 |
| 0.7472222222222222 | 0 |
| 0.7479166666666667 | 0 |
| 0.748611111111111 | 0 |
| 0.7493055555555556 | 0 |
| 0.75 | 0 |
| 0.7506944444444444 | 0 |
| 0.751388888888889 | 0 |
| 0.7520833333333333 | 0 |
| 0.7527777777777778 | 0 |
| 0.7534722222222222 | 0 |
| 0.7541666666666668 | 0 |
| 0.7548611111111111 | 0 |
| 0.7555555555555555 | 0 |
| 0.75625 | 0 |
| 0.7569444444444445 | 0 |
| 0.7576388888888889 | 0 |
| 0.7583333333333333 | 0 |
| 0.7590277777777777 | 0 |
| 0.7597222222222223 | 0 |
| 0.7604166666666666 | 0 |
| 0.7611111111111111 | 0 |
| 0.7618055555555556 | 0 |
| 0.7625000000000001 | 0 |
| 0.7631944444444444 | 0 |
| 0.7638888888888888 | 0 |
| 0.7645833333333334 | 0 |
| 0.7652777777777778 | 0 |
| 0.7659722222222222 | 0 |
| 0.7666666666666666 | 0 |
| 0.7673611111111112 | 0 |
| 0.7680555555555556 | 0 |
| 0.7687499999999999 | 0 |
| 0.7694444444444444 | 0 |
| 0.7701388888888889 | 0 |
| 0.7708333333333334 | 0 |
| 0.7715277777777777 | 0 |
| 0.7722222222222223 | 0 |
| 0.7729166666666667 | 0 |
| 0.7736111111111111 | 0 |
| 0.7743055555555555 | 0 |
| 0.775 | 0 |
| 0.7756944444444445 | 0 |
| 0.7763888888888889 | 0 |
| 0.7770833333333332 | 0 |
| 0.7777777777777778 | 0 |
| 0.7784722222222222 | 0 |
| 0.7791666666666667 | 0 |
| 0.779861111111111 | 0 |
| 0.7805555555555556 | 0 |
| 0.78125 | 0 |
| 0.7819444444444444 | 0 |
| 0.782638888888889 | 0 |
| 0.7833333333333333 | 0 |
| 0.7840277777777778 | 0 |
| 0.7847222222222222 | 0 |
| 0.7854166666666668 | 0 |
| 0.7861111111111111 | 0 |
| 0.7868055555555555 | 0 |
| 0.7875 | 0 |
| 0.7881944444444445 | 0 |
| 0.7888888888888889 | 0 |
| 0.7895833333333333 | 0 |
| 0.7902777777777777 | 0 |
| 0.7909722222222223 | 0 |
| 0.7916666666666666 | 0 |
| 0.7923611111111111 | 0 |
| 0.7930555555555556 | 0 |
| 0.7937500000000001 | 0 |
| 0.7944444444444444 | 0 |
| 0.7951388888888888 | 0 |
| 0.7958333333333334 | 0 |
| 0.7965277777777778 | 0 |
| 0.7972222222222222 | 0 |
| 0.7979166666666666 | 0 |
| 0.7986111111111112 | 0 |
| 0.7993055555555556 | 0 |
| 0.7999999999999999 | 0 |
| 0.8006944444444444 | 0 |
| 0.8013888888888889 | 0 |
| 0.8020833333333334 | 0 |
| 0.8027777777777777 | 0 |
| 0.8034722222222223 | 0 |
| 0.8041666666666667 | 0 |
| 0.8048611111111111 | 0 |
| 0.8055555555555555 | 0 |
| 0.80625 | 0 |
| 0.8069444444444445 | 0 |
| 0.8076388888888889 | 0 |
| 0.8083333333333332 | 0 |
| 0.8090277777777778 | 0 |
| 0.8097222222222222 | 0 |
| 0.8104166666666667 | 0 |
| 0.811111111111111 | 0 |
| 0.8118055555555556 | 0 |
| 0.8125 | 0 |
| 0.8131944444444444 | 0 |
| 0.813888888888889 | 0 |
| 0.8145833333333333 | 0 |
| 0.8152777777777778 | 0 |
| 0.8159722222222222 | 0 |
| 0.8166666666666668 | 0 |
| 0.8173611111111111 | 0 |
| 0.8180555555555555 | 0 |
| 0.81875 | 0 |
| 0.8194444444444445 | 0 |
| 0.8201388888888889 | 0 |
| 0.8208333333333333 | 0 |
| 0.8215277777777777 | 0 |
| 0.8222222222222223 | 0 |
| 0.8229166666666666 | 0 |
| 0.8236111111111111 | 0 |
| 0.8243055555555556 | 0 |
| 0.8250000000000001 | 0 |
| 0.8256944444444444 | 0 |
| 0.8263888888888888 | 0 |
| 0.8270833333333334 | 0 |
| 0.8277777777777778 | 0 |
| 0.8284722222222222 | 0 |
| 0.8291666666666666 | 0 |
| 0.8298611111111112 | 0 |
| 0.8305555555555556 | 0 |
| 0.8312499999999999 | 0 |
| 0.8319444444444444 | 0 |
| 0.8326388888888889 | 0 |
| 0.8333333333333334 | 0 |
| 0.8340277777777777 | 0 |
| 0.8347222222222223 | 0 |
| 0.8354166666666667 | 0 |
| 0.8361111111111111 | 0 |
| 0.8368055555555555 | 0 |
| 0.8375 | 0 |
| 0.8381944444444445 | 0 |
| 0.8388888888888889 | 0 |
| 0.8395833333333332 | 0 |
| 0.8402777777777778 | 0 |
| 0.8409722222222222 | 0 |
| 0.8416666666666667 | 0 |
| 0.842361111111111 | 0 |
| 0.8430555555555556 | 0 |
| 0.84375 | 0 |
| 0.8444444444444444 | 0 |
| 0.845138888888889 | 0 |
| 0.8458333333333333 | 0 |
| 0.8465277777777778 | 0 |
| 0.8472222222222222 | 0 |
| 0.8479166666666668 | 0 |
| 0.8486111111111111 | 0 |
| 0.8493055555555555 | 0 |
| 0.85 | 0 |
| 0.8506944444444445 | 0 |
| 0.8513888888888889 | 0 |
| 0.8520833333333333 | 0 |
| 0.8527777777777777 | 0 |
| 0.8534722222222223 | 0 |
| 0.8541666666666666 | 0 |
| 0.8548611111111111 | 0 |
| 0.8555555555555556 | 0 |
| 0.8562500000000001 | 0 |
| 0.8569444444444444 | 0 |
| 0.8576388888888888 | 0 |
| 0.8583333333333334 | 0 |
| 0.8590277777777778 | 0 |
| 0.8597222222222222 | 0 |
| 0.8604166666666666 | 0 |
| 0.8611111111111112 | 0 |
| 0.8618055555555556 | 0 |
| 0.8624999999999999 | 0 |
| 0.8631944444444444 | 0 |
| 0.8638888888888889 | 0 |
| 0.8645833333333334 | 0 |
| 0.8652777777777777 | 0 |
| 0.8659722222222223 | 0 |
| 0.8666666666666667 | 0 |
| 0.8673611111111111 | 0 |
| 0.8680555555555555 | 0 |
| 0.86875 | 0 |
| 0.8694444444444445 | 0 |
| 0.8701388888888889 | 0 |
| 0.8708333333333332 | 0 |
| 0.8715277777777778 | 0 |
| 0.8722222222222222 | 0 |
| 0.8729166666666667 | 0 |
| 0.873611111111111 | 0 |
| 0.8743055555555556 | 0 |
| 0.875 | 0 |
| 0.8756944444444444 | 0 |
| 0.876388888888889 | 0 |
| 0.8770833333333333 | 0 |
| 0.8777777777777778 | 0 |
| 0.8784722222222222 | 0 |
| 0.8791666666666668 | 0 |
| 0.8798611111111111 | 0 |
| 0.8805555555555555 | 0 |
| 0.88125 | 0 |
| 0.8819444444444445 | 0 |
| 0.8826388888888889 | 0 |
| 0.8833333333333333 | 0 |
| 0.8840277777777777 | 0 |
| 0.8847222222222223 | 0 |
| 0.8854166666666666 | 0 |
| 0.8861111111111111 | 0 |
| 0.8868055555555556 | 0 |
| 0.8875000000000001 | 0 |
| 0.8881944444444444 | 0 |
| 0.8888888888888888 | 0 |
| 0.8895833333333334 | 0 |
| 0.8902777777777778 | 0 |
| 0.8909722222222222 | 0 |
| 0.8916666666666666 | 0 |
| 0.8923611111111112 | 0 |
| 0.8930555555555556 | 0 |
| 0.8937499999999999 | 0 |
| 0.8944444444444444 | 0 |
| 0.8951388888888889 | 0 |
| 0.8958333333333334 | 0 |
| 0.8965277777777777 | 0 |
| 0.8972222222222223 | 0 |
| 0.8979166666666667 | 0 |
| 0.8986111111111111 | 0 |
| 0.8993055555555555 | 0 |
| 0.9 | 0 |
| 0.9006944444444445 | 0 |
| 0.9013888888888889 | 0 |
| 0.9020833333333332 | 0 |
| 0.9027777777777778 | 0 |
| 0.9034722222222222 | 0 |
| 0.9041666666666667 | 0 |
| 0.904861111111111 | 0 |
| 0.9055555555555556 | 0 |
| 0.90625 | 0 |
| 0.9069444444444444 | 0 |
| 0.907638888888889 | 0 |
| 0.9083333333333333 | 0 |
| 0.9090277777777778 | 0 |
| 0.9097222222222222 | 0 |
| 0.9104166666666668 | 0 |
| 0.9111111111111111 | 0 |
| 0.9118055555555555 | 0 |
| 0.9125 | 0 |
| 0.9131944444444445 | 0 |
| 0.9138888888888889 | 0 |
| 0.9145833333333333 | 0 |
| 0.9152777777777777 | 0 |
| 0.9159722222222223 | 0 |
| 0.9166666666666666 | 0 |
| 0.9173611111111111 | 0 |
| 0.9180555555555556 | 0 |
| 0.9187500000000001 | 0 |
| 0.9194444444444444 | 0 |
| 0.9201388888888888 | 0 |
| 0.9208333333333334 | 0 |
| 0.9215277777777778 | 0 |
| 0.9222222222222222 | 0 |
| 0.9229166666666666 | 0 |
| 0.9236111111111112 | 0 |
| 0.9243055555555556 | 0 |
| 0.9249999999999999 | 0 |
| 0.9256944444444444 | 0 |
| 0.9263888888888889 | 0 |
| 0.9270833333333334 | 0 |
| 0.9277777777777777 | 0 |
| 0.9284722222222223 | 0 |
| 0.9291666666666667 | 0 |
| 0.9298611111111111 | 0 |
| 0.9305555555555555 | 0 |
| 0.93125 | 0 |
| 0.9319444444444445 | 0 |
| 0.9326388888888889 | 0 |
| 0.9333333333333332 | 0 |
| 0.9340277777777778 | 0 |
| 0.9347222222222222 | 0 |
| 0.9354166666666667 | 0 |
| 0.936111111111111 | 0 |
| 0.9368055555555556 | 0 |
| 0.9375 | 0 |
| 0.9381944444444444 | 0 |
| 0.938888888888889 | 0 |
| 0.9395833333333333 | 0 |
| 0.9402777777777778 | 0 |
| 0.9409722222222222 | 0 |
| 0.9416666666666668 | 0 |
| 0.9423611111111111 | 0 |
| 0.9430555555555555 | 0 |
| 0.94375 | 0 |
| 0.9444444444444445 | 0 |
| 0.9451388888888889 | 0 |
| 0.9458333333333333 | 0 |
| 0.9465277777777777 | 0 |
| 0.9472222222222223 | 0 |
| 0.9479166666666666 | 0 |
| 0.9486111111111111 | 0 |
| 0.9493055555555556 | 0 |
| 0.9500000000000001 | 0 |
| 0.9506944444444444 | 0 |
| 0.9513888888888888 | 0 |
| 0.9520833333333334 | 0 |
| 0.9527777777777778 | 0 |
| 0.9534722222222222 | 0 |
| 0.9541666666666666 | 0 |
| 0.9548611111111112 | 0 |
| 0.9555555555555556 | 0 |
| 0.9562499999999999 | 0 |
| 0.9569444444444444 | 0 |
| 0.9576388888888889 | 0 |
| 0.9583333333333334 | 0 |
| 0.9590277777777777 | 0 |
| 0.9597222222222223 | 0 |
| 0.9604166666666667 | 0 |
| 0.9611111111111111 | 0 |
| 0.9618055555555555 | 0 |
| 0.9625 | 0 |
| 0.9631944444444445 | 0 |
| 0.9638888888888889 | 0 |
| 0.9645833333333332 | 0 |
| 0.9652777777777778 | 0 |
| 0.9659722222222222 | 0 |
| 0.9666666666666667 | 0 |
| 0.967361111111111 | 0 |
| 0.9680555555555556 | 0 |
| 0.96875 | 0 |
| 0.9694444444444444 | 0 |
| 0.970138888888889 | 0 |
| 0.9708333333333333 | 0 |
| 0.9715277777777778 | 0 |
| 0.9722222222222222 | 0 |
| 0.9729166666666668 | 0 |
| 0.9736111111111111 | 0 |
| 0.9743055555555555 | 0 |
| 0.975 | 0 |
| 0.9756944444444445 | 0 |
| 0.9763888888888889 | 0 |
| 0.9770833333333333 | 0 |
| 0.9777777777777777 | 0 |
| 0.9784722222222223 | 0 |
| 0.9791666666666666 | 0 |
| 0.9798611111111111 | 0 |
| 0.9805555555555556 | 0 |
| 0.9812500000000001 | 0 |
| 0.9819444444444444 | 0 |
| 0.9826388888888888 | 0 |
| 0.9833333333333334 | 0 |
| 0.9840277777777778 | 0 |
| 0.9847222222222222 | 0 |
| 0.9854166666666666 | 0 |
| 0.9861111111111112 | 0 |
| 0.9868055555555556 | 0 |
| 0.9874999999999999 | 0 |
| 0.9881944444444444 | 0 |
| 0.9888888888888889 | 0 |
| 0.9895833333333334 | 0 |
| 0.9902777777777777 | 0 |
| 0.9909722222222223 | 0 |
| 0.9916666666666667 | 0 |
| 0.9923611111111111 | 0 |
| 0.9930555555555555 | 0 |
| 0.99375 | 0 |
| 0.9944444444444445 | 0 |
| 0.9951388888888889 | 0 |
| 0.9958333333333332 | 0 |
| 0.9965277777777778 | 0 |
| 0.9972222222222222 | 0 |
| 0.9979166666666667 | 0 |
| 0.998611111111111 | 0 |
| 0.9993055555555556 | 0 |